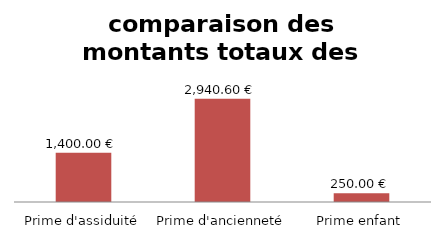
| Category | Series 0 |
|---|---|
| Prime d'assiduité | 1400 |
| Prime d'ancienneté | 2940.6 |
| Prime enfant | 250 |